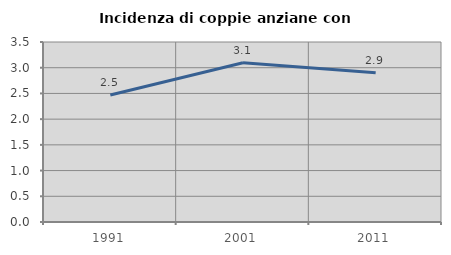
| Category | Incidenza di coppie anziane con figli |
|---|---|
| 1991.0 | 2.469 |
| 2001.0 | 3.096 |
| 2011.0 | 2.9 |